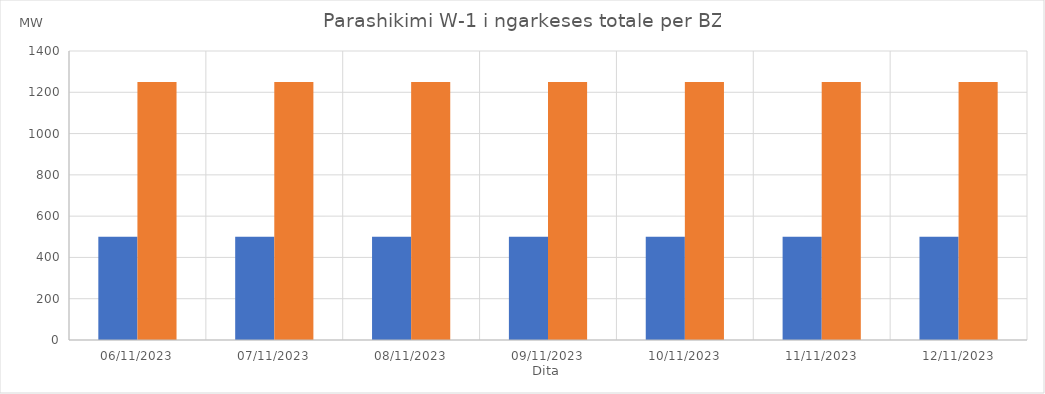
| Category | Min (MW) | Max (MW) |
|---|---|---|
| 06/11/2023 | 500 | 1250 |
| 07/11/2023 | 500 | 1250 |
| 08/11/2023 | 500 | 1250 |
| 09/11/2023 | 500 | 1250 |
| 10/11/2023 | 500 | 1250 |
| 11/11/2023 | 500 | 1250 |
| 12/11/2023 | 500 | 1250 |